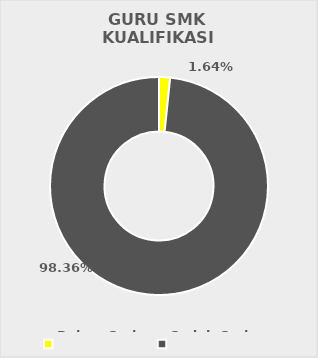
| Category | GURU SMK 
KUALIFIKASI S1 |
|---|---|
| Belum Sarjana | 16 |
| Sudah Sarjana | 961 |